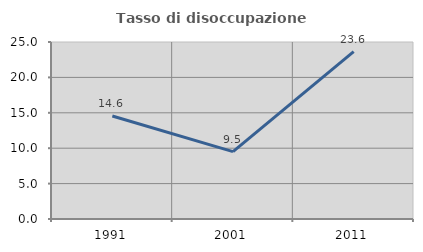
| Category | Tasso di disoccupazione giovanile  |
|---|---|
| 1991.0 | 14.557 |
| 2001.0 | 9.524 |
| 2011.0 | 23.636 |